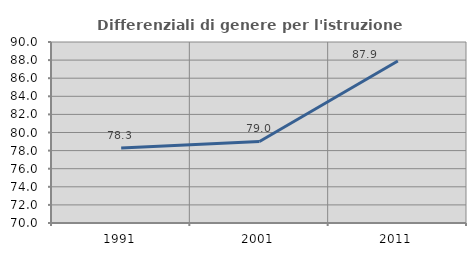
| Category | Differenziali di genere per l'istruzione superiore |
|---|---|
| 1991.0 | 78.282 |
| 2001.0 | 79.01 |
| 2011.0 | 87.897 |